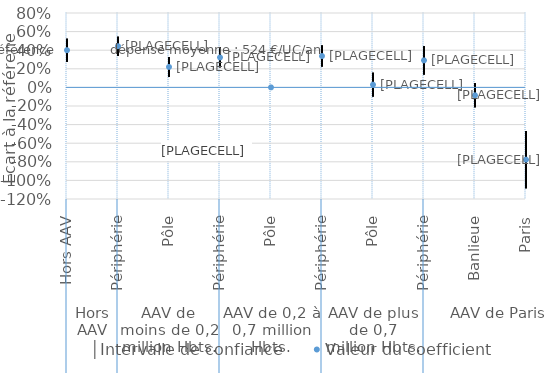
| Category | │Intervalle de confiance | Series 1 | Valeur du coefficient |
|---|---|---|---|
| 0 | 0.524 | 0.277 | 0.4 |
| 1 | 0.544 | 0.341 | 0.443 |
| 2 | 0.326 | 0.114 | 0.22 |
| 3 | 0.428 | 0.216 | 0.322 |
| 4 | 0 | 0 | 0 |
| 5 | 0.451 | 0.224 | 0.337 |
| 6 | 0.157 | -0.099 | 0.029 |
| 7 | 0.443 | 0.138 | 0.291 |
| 8 | 0.045 | -0.214 | -0.085 |
| 9 | -0.47 | -1.084 | -0.777 |